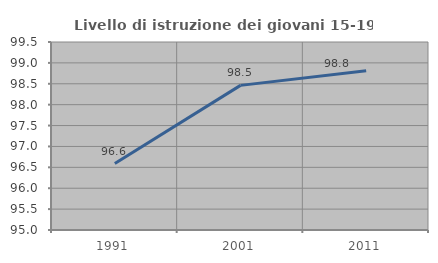
| Category | Livello di istruzione dei giovani 15-19 anni |
|---|---|
| 1991.0 | 96.591 |
| 2001.0 | 98.462 |
| 2011.0 | 98.81 |